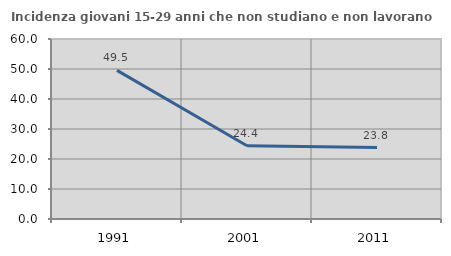
| Category | Incidenza giovani 15-29 anni che non studiano e non lavorano  |
|---|---|
| 1991.0 | 49.544 |
| 2001.0 | 24.43 |
| 2011.0 | 23.81 |